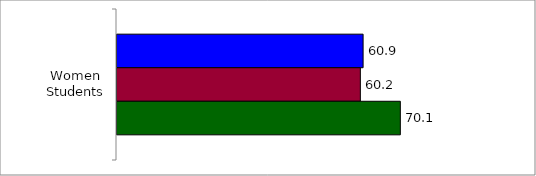
| Category | 50 States and D.C. | SREB States | State |
|---|---|---|---|
| Women Students | 60.915 | 60.236 | 70.133 |